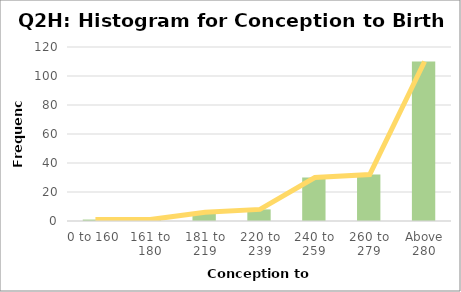
| Category | Series 0 |
|---|---|
| 0 to 160 | 1 |
| 161 to 180 | 1 |
| 181 to 219 | 6 |
| 220 to 239 | 8 |
| 240 to 259 | 30 |
| 260 to 279 | 32 |
| Above 280 | 110 |